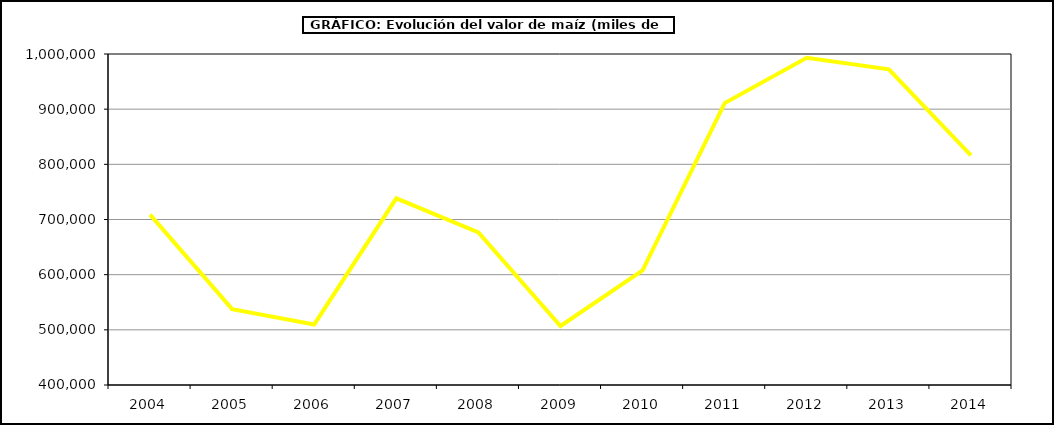
| Category | Valor |
|---|---|
| 2004.0 | 708729.265 |
| 2005.0 | 537484.95 |
| 2006.0 | 509734.172 |
| 2007.0 | 738436.616 |
| 2008.0 | 676616.122 |
| 2009.0 | 506951.971 |
| 2010.0 | 607777.279 |
| 2011.0 | 910964.166 |
| 2012.0 | 993073.028 |
| 2013.0 | 972315.092 |
| 2014.0 | 816366 |